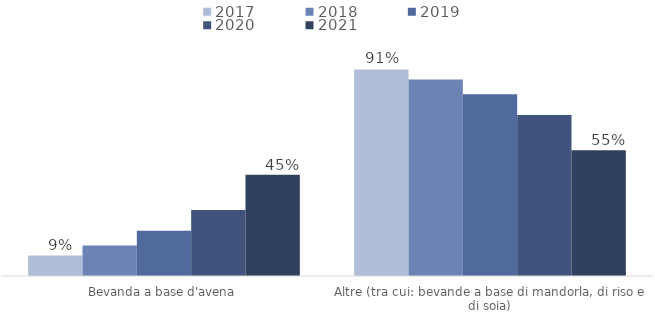
| Category | 2017 | 2018 | 2019 | 2020 | 2021 |
|---|---|---|---|---|---|
| Bevanda a base d'avena | 0.09 | 0.134 | 0.199 | 0.291 | 0.447 |
| Altre (tra cui: bevande a base di mandorla, di riso e di soia) | 0.91 | 0.866 | 0.801 | 0.709 | 0.553 |